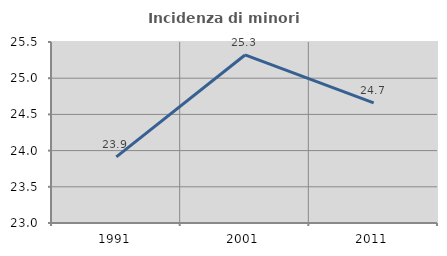
| Category | Incidenza di minori stranieri |
|---|---|
| 1991.0 | 23.913 |
| 2001.0 | 25.321 |
| 2011.0 | 24.658 |